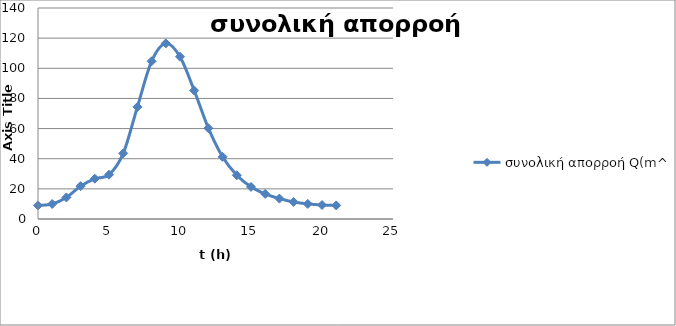
| Category | συνολική απορροή Q(m^3/s) |
|---|---|
| 0.0 | 9 |
| 1.0 | 9.954 |
| 2.0 | 14.322 |
| 3.0 | 21.804 |
| 4.0 | 26.73 |
| 5.0 | 29.412 |
| 6.0 | 43.516 |
| 7.0 | 74.36 |
| 8.0 | 104.642 |
| 9.0 | 116.52 |
| 10.0 | 107.672 |
| 11.0 | 85.272 |
| 12.0 | 60.248 |
| 13.0 | 41.228 |
| 14.0 | 29.046 |
| 15.0 | 21.3 |
| 16.0 | 16.652 |
| 17.0 | 13.55 |
| 18.0 | 11.292 |
| 19.0 | 10.008 |
| 20.0 | 9.288 |
| 21.0 | 9 |